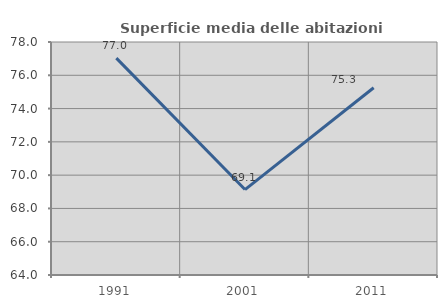
| Category | Superficie media delle abitazioni occupate |
|---|---|
| 1991.0 | 77.033 |
| 2001.0 | 69.134 |
| 2011.0 | 75.251 |